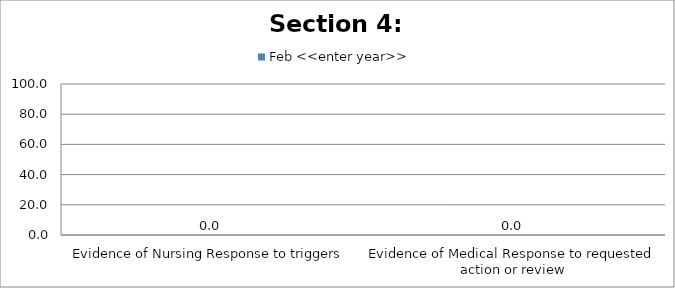
| Category | Feb <<enter year>> |
|---|---|
| Evidence of Nursing Response to triggers | 0 |
| Evidence of Medical Response to requested action or review | 0 |